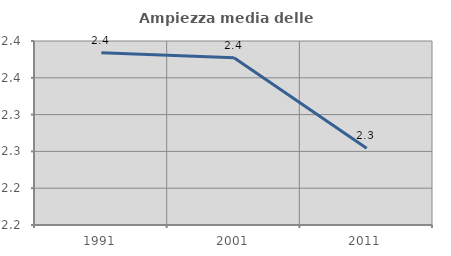
| Category | Ampiezza media delle famiglie |
|---|---|
| 1991.0 | 2.384 |
| 2001.0 | 2.377 |
| 2011.0 | 2.254 |